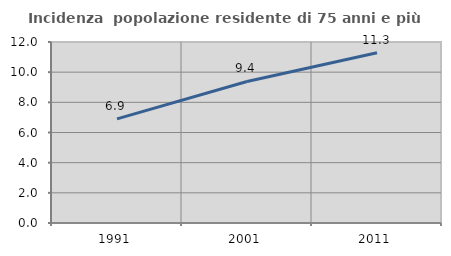
| Category | Incidenza  popolazione residente di 75 anni e più |
|---|---|
| 1991.0 | 6.903 |
| 2001.0 | 9.381 |
| 2011.0 | 11.286 |